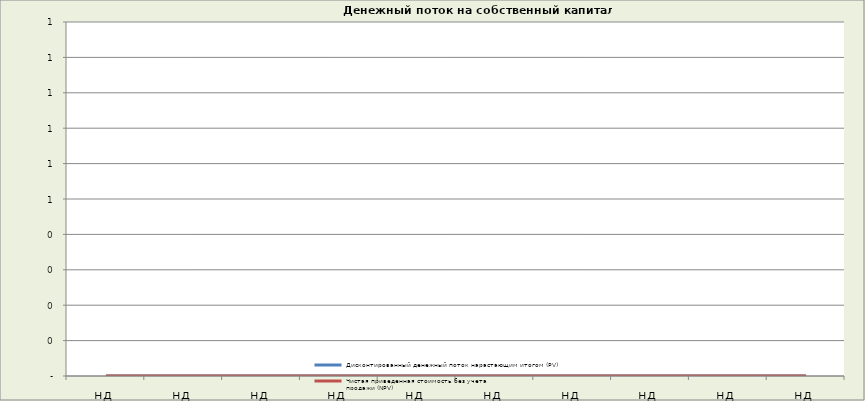
| Category | Дисконтированный денежный поток нарастающим итогом (PV)  | Чистая приведенная стоимость без учета      
продажи (NPV)  |
|---|---|---|
| нд | 0 | 0 |
| нд | 0 | 0 |
| нд | 0 | 0 |
| нд | 0 | 0 |
| нд | 0 | 0 |
| нд | 0 | 0 |
| нд | 0 | 0 |
| нд | 0 | 0 |
| нд | 0 | 0 |
| нд | 0 | 0 |